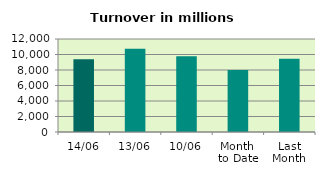
| Category | Series 0 |
|---|---|
| 14/06 | 9384.041 |
| 13/06 | 10734.861 |
| 10/06 | 9777.82 |
| Month 
to Date | 7999.407 |
| Last
Month | 9444.716 |